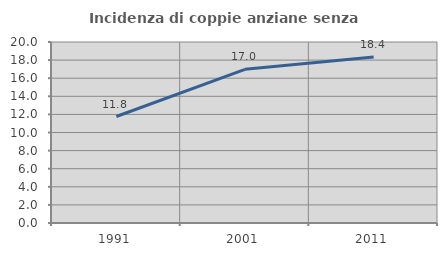
| Category | Incidenza di coppie anziane senza figli  |
|---|---|
| 1991.0 | 11.765 |
| 2001.0 | 16.981 |
| 2011.0 | 18.354 |